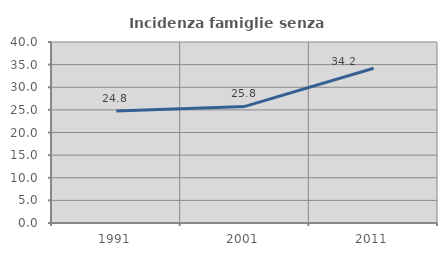
| Category | Incidenza famiglie senza nuclei |
|---|---|
| 1991.0 | 24.768 |
| 2001.0 | 25.769 |
| 2011.0 | 34.192 |